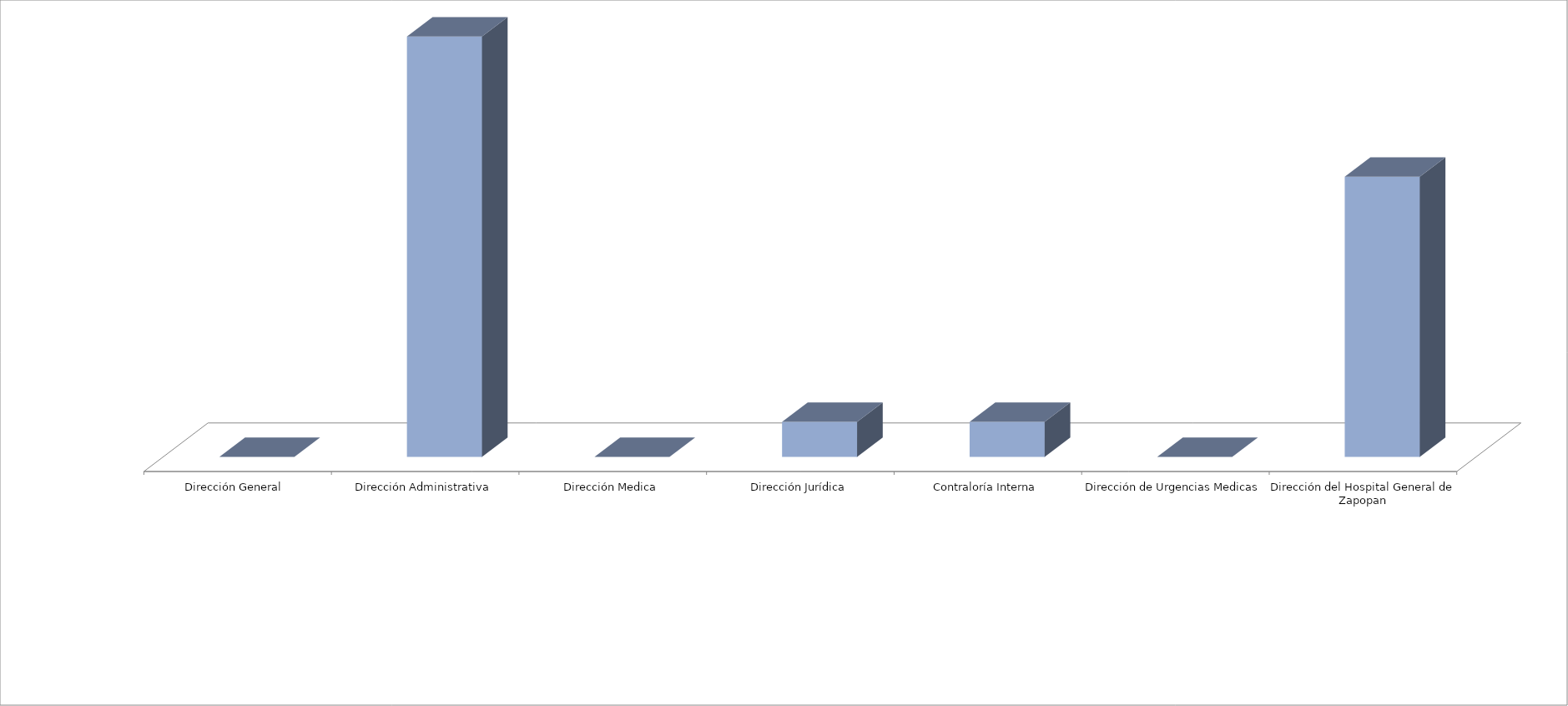
| Category | Series 0 | Series 1 |
|---|---|---|
| Dirección General  |  | 0 |
| Dirección Administrativa |  | 12 |
| Dirección Medica |  | 0 |
| Dirección Jurídica |  | 1 |
| Contraloría Interna |  | 1 |
| Dirección de Urgencias Medicas |  | 0 |
| Dirección del Hospital General de Zapopan |  | 8 |